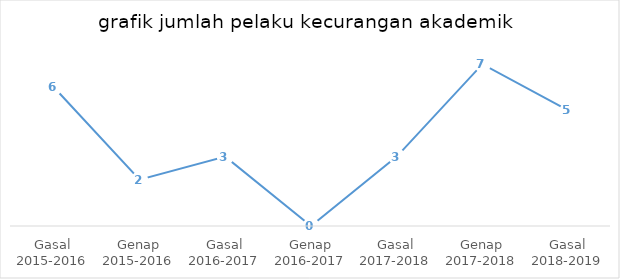
| Category | Series 0 |
|---|---|
| Gasal 2015-2016 | 6 |
| Genap 2015-2016 | 2 |
| Gasal 2016-2017 | 3 |
| Genap 2016-2017 | 0 |
| Gasal 2017-2018 | 3 |
| Genap 2017-2018 | 7 |
| Gasal 2018-2019 | 5 |